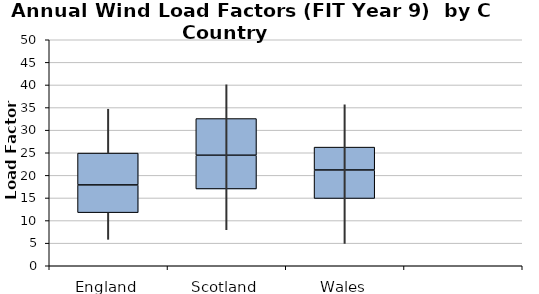
| Category | Series 0 | Series 1 | Series 2 |
|---|---|---|---|
| 0 | 11.75 | 6.13 | 7.05 |
| 1 | 16.99 | 7.46 | 8.12 |
| 2 | 14.88 | 6.31 | 5.06 |